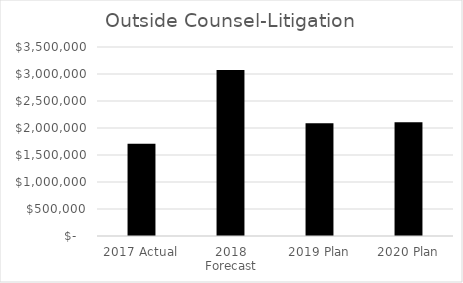
| Category | Amount |
|---|---|
| 2017 Actual | 1710000 |
| 2018 Forecast | 3073000 |
| 2019 Plan | 2086000 |
| 2020 Plan | 2107000 |